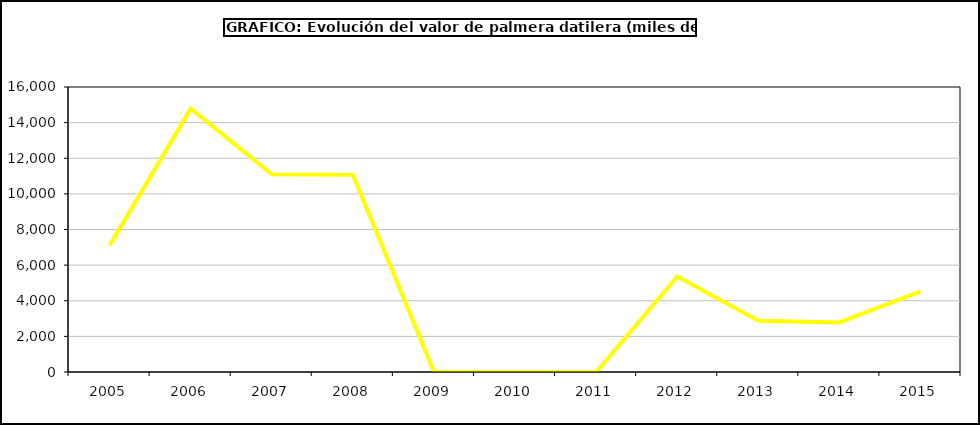
| Category | valor kiwi |
|---|---|
| 2005.0 | 7107.672 |
| 2006.0 | 14786.24 |
| 2007.0 | 11098.832 |
| 2008.0 | 11066.726 |
| 2009.0 | 0 |
| 2010.0 | 0 |
| 2011.0 | 0 |
| 2012.0 | 5362.2 |
| 2013.0 | 2872 |
| 2014.0 | 2781 |
| 2015.0 | 4520 |